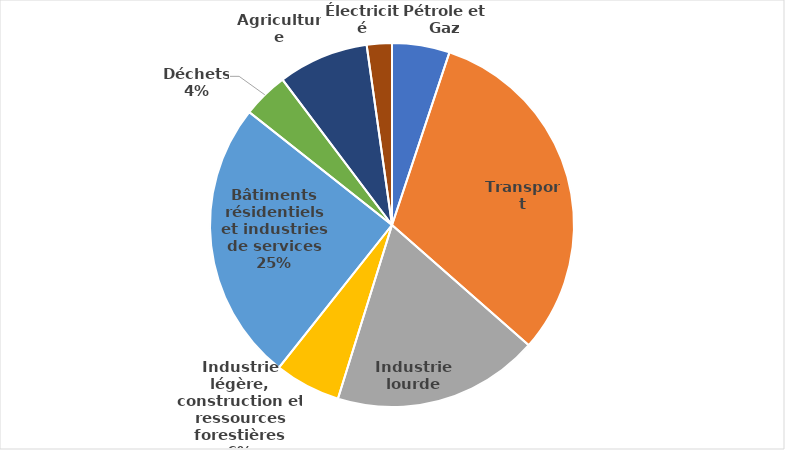
| Category | Series 0 |
|---|---|
| Pétrole et Gaz | 7.696 |
| Transport | 47.224 |
| Industrie lourde | 27.593 |
| Industrie légère, construction et ressources forestières | 8.829 |
| Bâtiments résidentiels et industries de services | 37.611 |
| Déchets | 6.139 |
| Agriculture | 12.114 |
| Électricité | 3.355 |